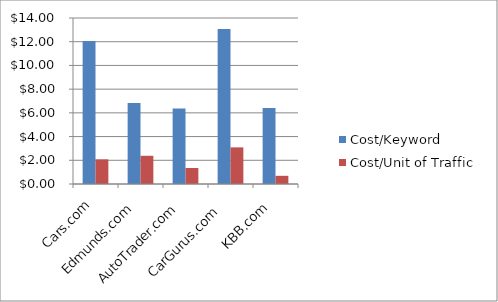
| Category | Cost/Keyword | Cost/Unit of Traffic  |
|---|---|---|
| Cars.com  | 12.05 | 2.08 |
| Edmunds.com  | 6.83 | 2.38 |
| AutoTrader.com   | 6.36 | 1.35 |
| CarGurus.com   | 13.08 | 3.09 |
| KBB.com  | 6.4 | 0.69 |